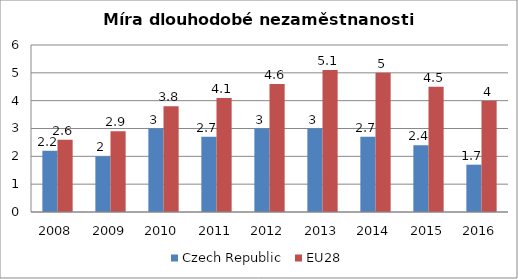
| Category | Czech Republic | EU28 |
|---|---|---|
| 2008 | 2.2 | 2.6 |
| 2009 | 2 | 2.9 |
| 2010 | 3 | 3.8 |
| 2011 | 2.7 | 4.1 |
| 2012 | 3 | 4.6 |
| 2013 | 3 | 5.1 |
| 2014 | 2.7 | 5 |
| 2015 | 2.4 | 4.5 |
| 2016 | 1.7 | 4 |